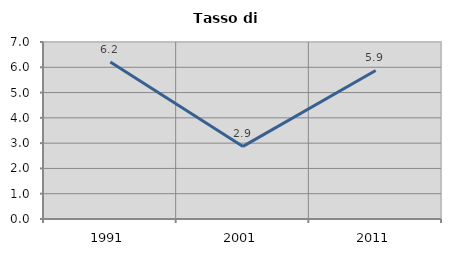
| Category | Tasso di disoccupazione   |
|---|---|
| 1991.0 | 6.208 |
| 2001.0 | 2.871 |
| 2011.0 | 5.873 |